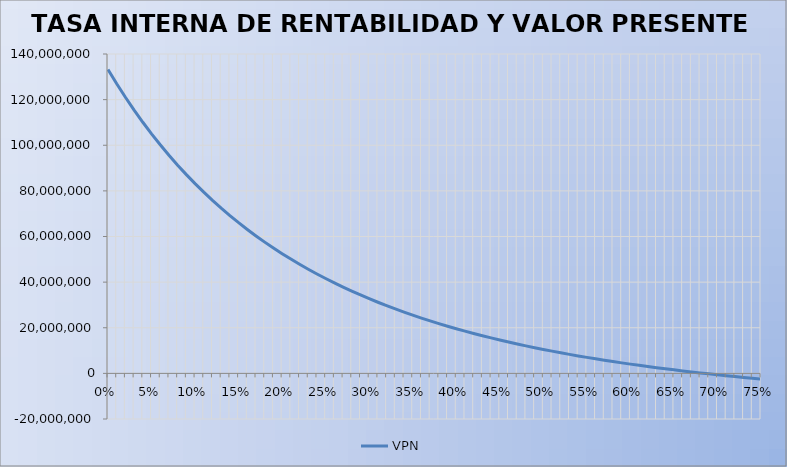
| Category | VPN |
|---|---|
| 0.0 | 133211916.485 |
| 0.01 | 126960814.264 |
| 0.02 | 121034666.157 |
| 0.03 | 115413305.249 |
| 0.04 | 110078010.258 |
| 0.05 | 105011388.555 |
| 0.06 | 100197269.694 |
| 0.07 | 95620608.419 |
| 0.08 | 91267396.217 |
| 0.09 | 87124580.598 |
| 0.1 | 83179991.355 |
| 0.11 | 79422273.151 |
| 0.12 | 75840823.82 |
| 0.13 | 72425737.878 |
| 0.14 | 69167754.727 |
| 0.15 | 66058211.157 |
| 0.16 | 63088997.731 |
| 0.17 | 60252518.712 |
| 0.18 | 57541655.224 |
| 0.19 | 54949731.346 |
| 0.2 | 52470482.894 |
| 0.21 | 50098028.646 |
| 0.22 | 47826843.818 |
| 0.23 | 45651735.573 |
| 0.24 | 43567820.411 |
| 0.25 | 41570503.277 |
| 0.26 | 39655458.237 |
| 0.27 | 37818610.594 |
| 0.28 | 36056120.338 |
| 0.29 | 34364366.803 |
| 0.3 | 32739934.446 |
| 0.31 | 31179599.653 |
| 0.32 | 29680318.493 |
| 0.33 | 28239215.342 |
| 0.34 | 26853572.312 |
| 0.35 | 25520819.419 |
| 0.36 | 24238525.437 |
| 0.37 | 23004389.382 |
| 0.38 | 21816232.581 |
| 0.39 | 20671991.277 |
| 0.4 | 19569709.737 |
| 0.41 | 18507533.821 |
| 0.42 | 17483704.974 |
| 0.43 | 16496554.623 |
| 0.44 | 15544498.935 |
| 0.45 | 14626033.917 |
| 0.46 | 13739730.836 |
| 0.47 | 12884231.928 |
| 0.48 | 12058246.385 |
| 0.49 | 11260546.591 |
| 0.5 | 10489964.602 |
| 0.51 | 9745388.834 |
| 0.52 | 9025760.971 |
| 0.53 | 8330073.047 |
| 0.54 | 7657364.723 |
| 0.55 | 7006720.714 |
| 0.56 | 6377268.384 |
| 0.57 | 5768175.472 |
| 0.58 | 5178647.969 |
| 0.59 | 4607928.107 |
| 0.6 | 4055292.471 |
| 0.61 | 3520050.223 |
| 0.62 | 3001541.428 |
| 0.63 | 2499135.473 |
| 0.64 | 2012229.58 |
| 0.65 | 1540247.406 |
| 0.66 | 1082637.714 |
| 0.67 | 638873.127 |
| 0.68 | 208448.944 |
| 0.69 | -209117.969 |
| 0.7 | -614290.235 |
| 0.71 | -1007510.963 |
| 0.72 | -1389204.688 |
| 0.73 | -1759778.258 |
| 0.74 | -2119621.682 |
| 0.75 | -2469108.924 |